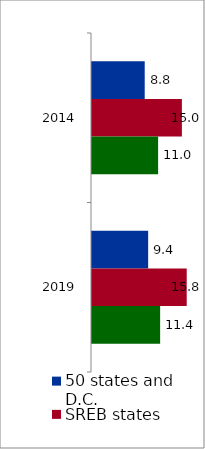
| Category | 50 states and D.C. | SREB states | State |
|---|---|---|---|
| 2014.0 | 8.786 | 14.982 | 11.018 |
| 2019.0 | 9.359 | 15.786 | 11.357 |